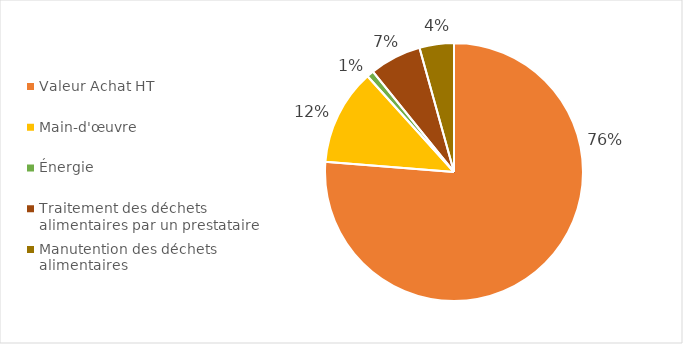
| Category | Series 0 |
|---|---|
| Valeur Achat HT | 139840 |
| Main-d'œuvre | 22080 |
| Énergie | 1600.8 |
| Traitement des déchets alimentaires par un prestataire | 11923.2 |
| Manutention des déchets alimentaires | 7912 |